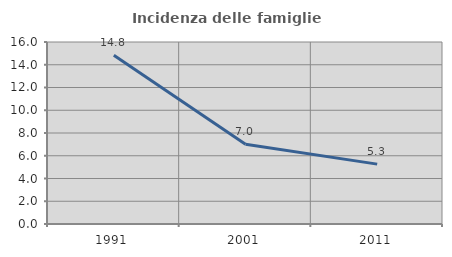
| Category | Incidenza delle famiglie numerose |
|---|---|
| 1991.0 | 14.835 |
| 2001.0 | 7.009 |
| 2011.0 | 5.263 |